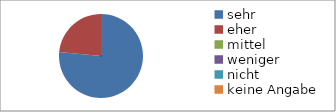
| Category | Series 0 |
|---|---|
| sehr | 13 |
| eher | 4 |
| mittel | 0 |
| weniger | 0 |
| nicht | 0 |
| keine Angabe | 0 |